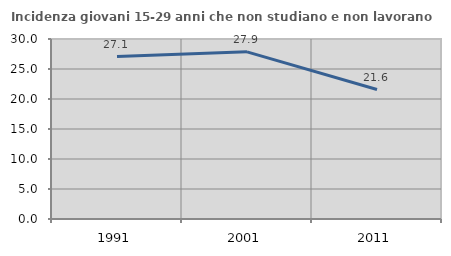
| Category | Incidenza giovani 15-29 anni che non studiano e non lavorano  |
|---|---|
| 1991.0 | 27.083 |
| 2001.0 | 27.862 |
| 2011.0 | 21.574 |